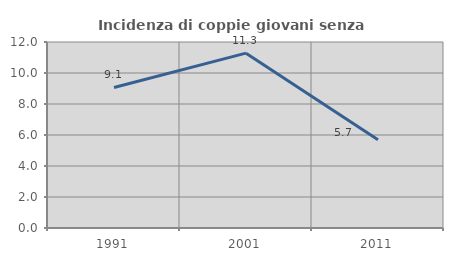
| Category | Incidenza di coppie giovani senza figli |
|---|---|
| 1991.0 | 9.068 |
| 2001.0 | 11.28 |
| 2011.0 | 5.694 |